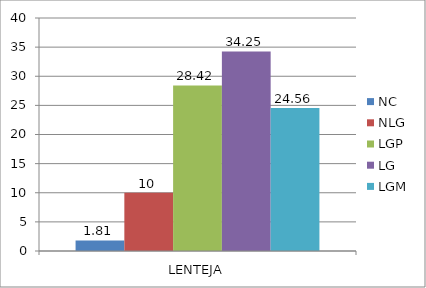
| Category | NC | NLG | LGP | LG | LGM |
|---|---|---|---|---|---|
| 0 | 1.81 | 10 | 28.42 | 34.25 | 24.56 |